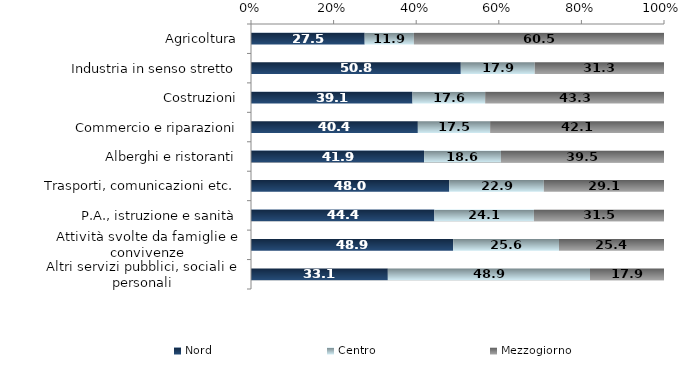
| Category | Nord | Centro | Mezzogiorno |
|---|---|---|---|
| Agricoltura | 27.5 | 11.9 | 60.5 |
| Industria in senso stretto | 50.8 | 17.9 | 31.3 |
| Costruzioni | 39.1 | 17.6 | 43.3 |
| Commercio e riparazioni | 40.4 | 17.5 | 42.1 |
| Alberghi e ristoranti | 41.9 | 18.6 | 39.5 |
| Trasporti, comunicazioni etc. | 48 | 22.9 | 29.1 |
| P.A., istruzione e sanità | 44.4 | 24.1 | 31.5 |
| Attività svolte da famiglie e convivenze | 48.9 | 25.6 | 25.4 |
| Altri servizi pubblici, sociali e personali | 33.1 | 48.9 | 17.9 |